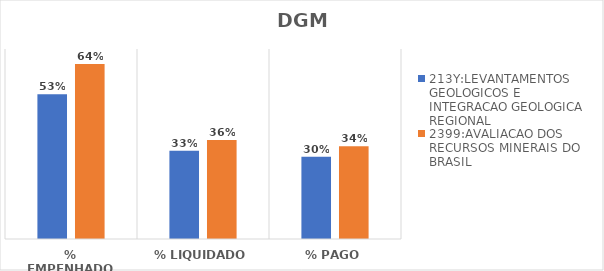
| Category | 213Y:LEVANTAMENTOS GEOLOGICOS E INTEGRACAO GEOLOGICA REGIONAL | 2399:AVALIACAO DOS RECURSOS MINERAIS DO BRASIL |
|---|---|---|
| % EMPENHADO | 0.534 | 0.644 |
| % LIQUIDADO | 0.325 | 0.365 |
| % PAGO | 0.303 | 0.342 |